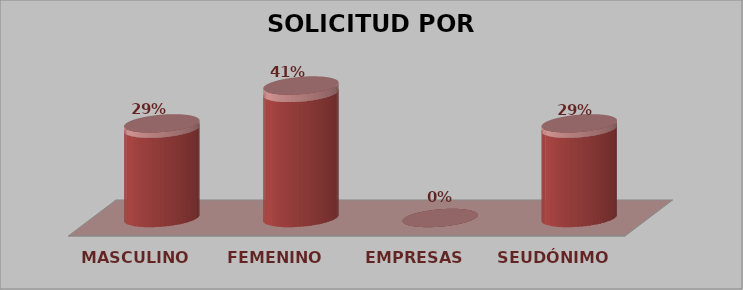
| Category | SOLICITUD POR SEXO | Series 1 |
|---|---|---|
| MASCULINO | 5 | 0.294 |
| FEMENINO | 7 | 0.412 |
| EMPRESAS | 0 | 0 |
| SEUDÓNIMO | 5 | 0.294 |